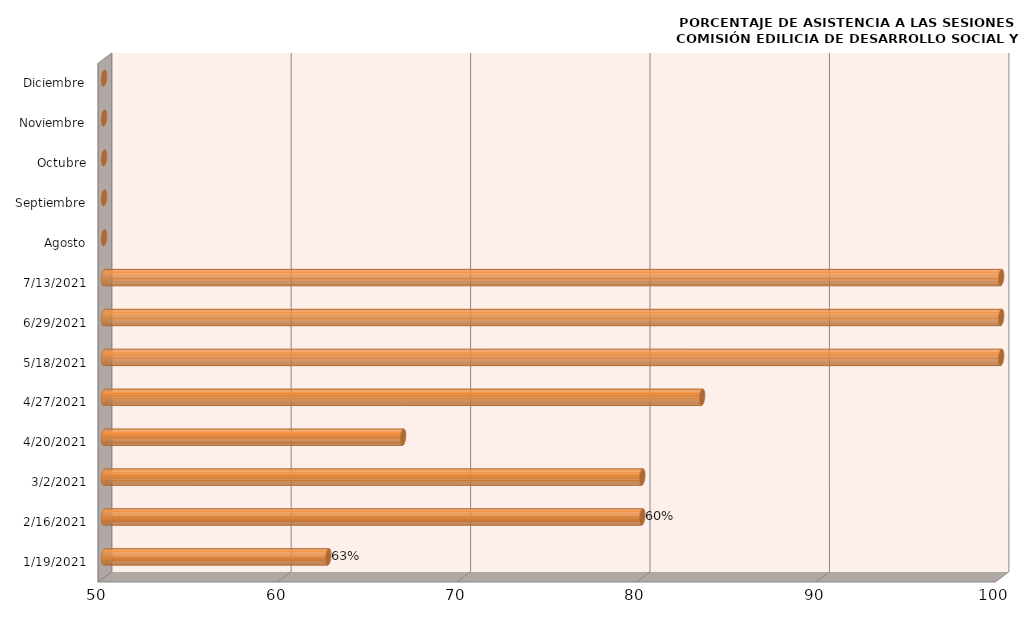
| Category | Series 0 |
|---|---|
| 19/01/2021 | 62.5 |
| 16/02/2021 | 80 |
| 02/03/2021 | 80 |
| 20/04/2021 | 66.667 |
| 27/04/2021 | 83.333 |
| 18/05/2021 | 100 |
| 29/06/2021 | 100 |
| 13/07/2021 | 100 |
| Agosto | 0 |
| Septiembre | 0 |
| Octubre | 0 |
| Noviembre | 0 |
| Diciembre | 0 |